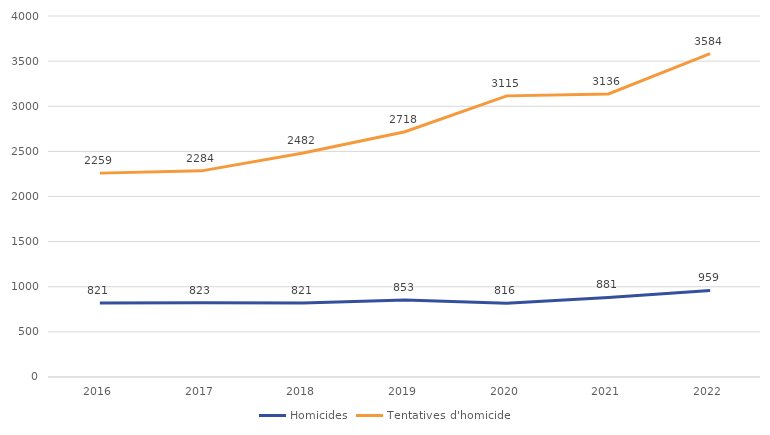
| Category | Homicides | Tentatives d'homicide |
|---|---|---|
| 2016 | 821 | 2259 |
| 2017 | 823 | 2284 |
| 2018 | 821 | 2482 |
| 2019 | 853 | 2718 |
| 2020 | 816 | 3115 |
| 2021 | 881 | 3136 |
| 2022 | 959 | 3584 |